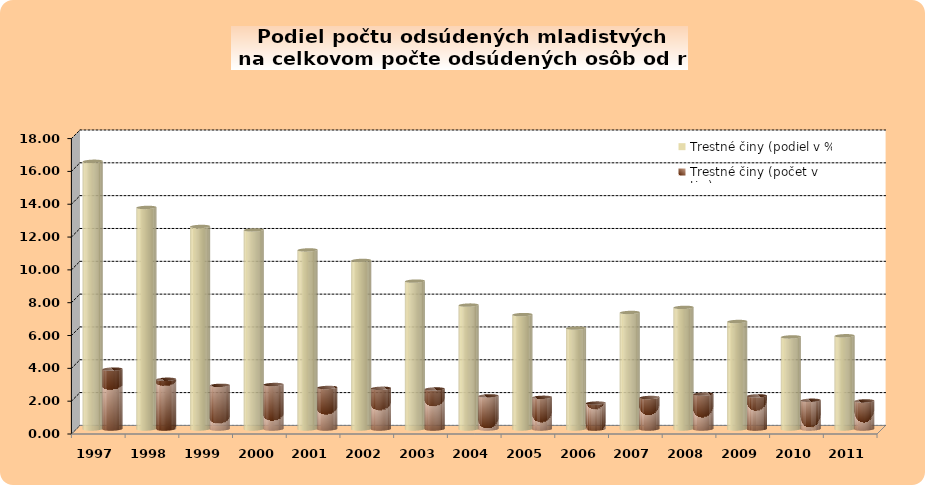
| Category | Trestné činy (podiel v %) | Trestné činy (počet v tis.) |
|---|---|---|
| 1997.0 | 16.31 | 3.65 |
| 1998.0 | 13.5 | 3.03 |
| 1999.0 | 12.34 | 2.66 |
| 2000.0 | 12.13 | 2.71 |
| 2001.0 | 10.91 | 2.53 |
| 2002.0 | 10.27 | 2.48 |
| 2003.0 | 9.01 | 2.44 |
| 2004.0 | 7.55 | 2.02 |
| 2005.0 | 6.97 | 1.93 |
| 2006.0 | 6.15 | 1.58 |
| 2007.0 | 7.1 | 1.92 |
| 2008.0 | 7.41 | 2.13 |
| 2009.0 | 6.55 | 2.02 |
| 2010.0 | 5.61 | 1.75 |
| 2011.0 | 5.68 | 1.71 |